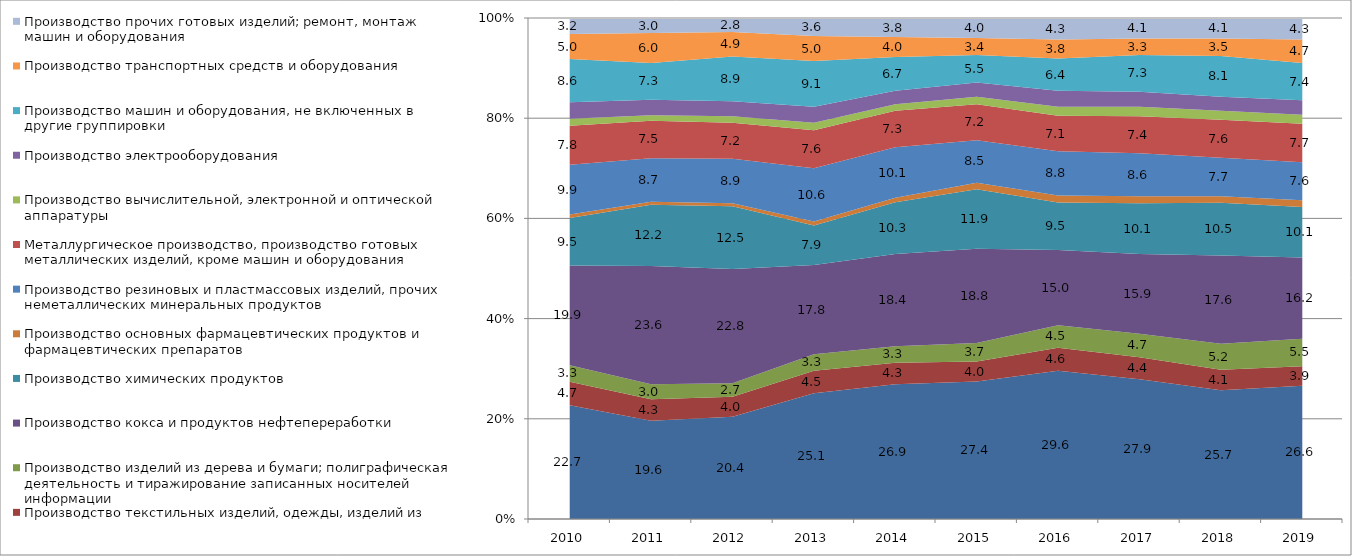
| Category | Производство продуктов питания, напитков и табачных изделий | Производство текстильных изделий, одежды, изделий из кожи и меха | Производство изделий из дерева и бумаги; полиграфическая деятельность и тиражирование записанных носителей информации | Производство кокса и продуктов нефтепереработки | Производство химических продуктов | Производство основных фармацевтических продуктов и фармацевтических препаратов | Производство резиновых и пластмассовых изделий, прочих неметаллических минеральных продуктов | Металлургическое производство, производство готовых металлических изделий, кроме машин и оборудования | Производство вычислительной, электронной и оптической аппаратуры | Производство электрооборудования | Производство машин и оборудования, не включенных в другие группировки | Производство транспортных средств и оборудования | Производство прочих готовых изделий; ремонт, монтаж машин и оборудования |
|---|---|---|---|---|---|---|---|---|---|---|---|---|---|
| 0 | 22.7 | 4.7 | 3.3 | 19.9 | 9.5 | 0.7 | 9.9 | 7.8 | 1.4 | 3.3 | 8.6 | 5 | 3.2 |
| 1 | 19.6 | 4.3 | 3 | 23.6 | 12.2 | 0.6 | 8.7 | 7.5 | 1.1 | 3.1 | 7.3 | 6 | 3 |
| 2 | 20.41 | 4 | 2.7 | 22.8 | 12.5 | 0.6 | 8.9 | 7.2 | 1.3 | 3 | 8.9 | 4.9 | 2.8 |
| 3 | 25.1 | 4.5 | 3.3 | 17.8 | 7.9 | 0.8 | 10.6 | 7.6 | 1.5 | 3.2 | 9.1 | 5 | 3.6 |
| 4 | 26.9 | 4.3 | 3.3 | 18.4 | 10.3 | 0.9 | 10.1 | 7.3 | 1.3 | 2.7 | 6.7 | 4 | 3.8 |
| 5 | 27.44 | 4 | 3.7 | 18.8 | 11.9 | 1.3 | 8.5 | 7.2 | 1.5 | 2.8 | 5.5 | 3.4 | 4 |
| 6 | 29.58 | 4.6 | 4.5 | 15 | 9.5 | 1.4 | 8.8 | 7.1 | 1.8 | 3.2 | 6.4 | 3.8 | 4.3 |
| 7 | 27.9 | 4.4 | 4.7 | 15.9 | 10.1 | 1.4 | 8.6 | 7.4 | 1.9 | 3 | 7.3 | 3.3 | 4.1 |
| 8 | 25.7 | 4.1 | 5.2 | 17.6 | 10.5 | 1.3 | 7.7 | 7.6 | 1.8 | 2.8 | 8.1 | 3.5 | 4.1 |
| 9 | 26.6 | 3.9 | 5.5 | 16.2 | 10.1 | 1.3 | 7.6 | 7.7 | 1.8 | 2.9 | 7.4 | 4.7 | 4.3 |